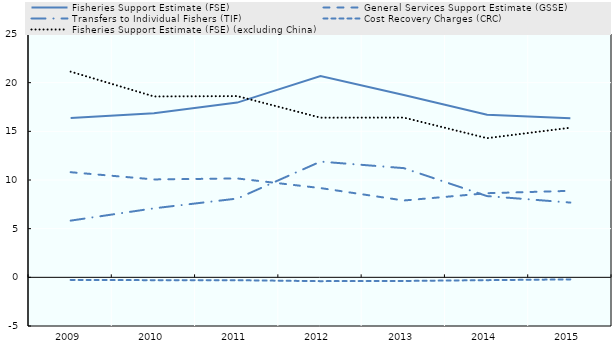
| Category | Fisheries Support Estimate (FSE) | General Services Support Estimate (GSSE) | Transfers to Individual Fishers (TIF) | Cost Recovery Charges (CRC) | Fisheries Support Estimate (FSE) (excluding China) |
|---|---|---|---|---|---|
| 2009.0 | 16.36 | 10.8 | 5.826 | -0.266 | 21.134 |
| 2010.0 | 16.858 | 10.059 | 7.09 | -0.291 | 18.583 |
| 2011.0 | 17.954 | 10.159 | 8.093 | -0.298 | 18.619 |
| 2012.0 | 20.67 | 9.171 | 11.89 | -0.391 | 16.407 |
| 2013.0 | 18.74 | 7.894 | 11.219 | -0.373 | 16.413 |
| 2014.0 | 16.701 | 8.644 | 8.346 | -0.289 | 14.297 |
| 2015.0 | 16.356 | 8.887 | 7.681 | -0.212 | 15.373 |